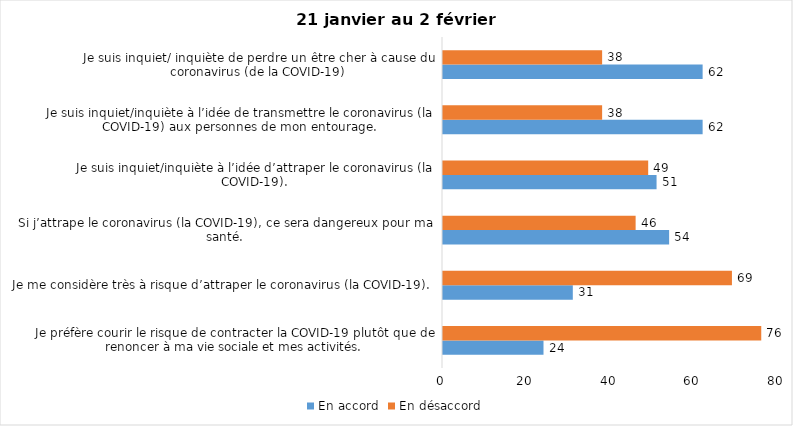
| Category | En accord | En désaccord |
|---|---|---|
| Je préfère courir le risque de contracter la COVID-19 plutôt que de renoncer à ma vie sociale et mes activités. | 24 | 76 |
| Je me considère très à risque d’attraper le coronavirus (la COVID-19). | 31 | 69 |
| Si j’attrape le coronavirus (la COVID-19), ce sera dangereux pour ma santé. | 54 | 46 |
| Je suis inquiet/inquiète à l’idée d’attraper le coronavirus (la COVID-19). | 51 | 49 |
| Je suis inquiet/inquiète à l’idée de transmettre le coronavirus (la COVID-19) aux personnes de mon entourage. | 62 | 38 |
| Je suis inquiet/ inquiète de perdre un être cher à cause du coronavirus (de la COVID-19) | 62 | 38 |